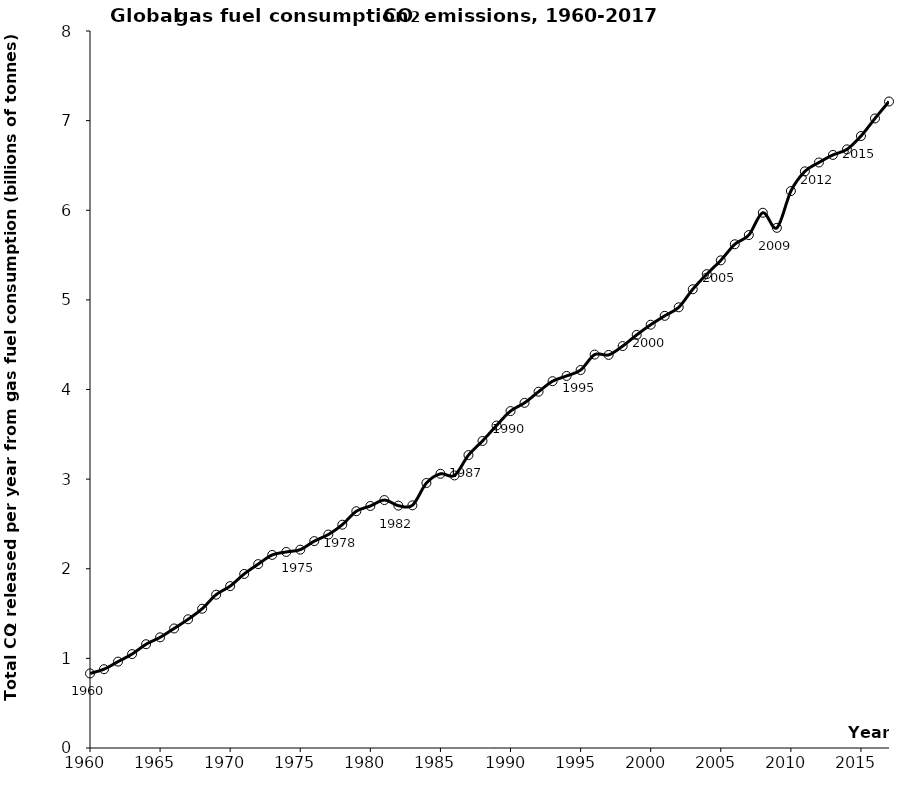
| Category | Series 0 |
|---|---|
| 1960.0 | 0.832 |
| 1961.0 | 0.879 |
| 1962.0 | 0.964 |
| 1963.0 | 1.048 |
| 1964.0 | 1.158 |
| 1965.0 | 1.235 |
| 1966.0 | 1.334 |
| 1967.0 | 1.436 |
| 1968.0 | 1.554 |
| 1969.0 | 1.711 |
| 1970.0 | 1.806 |
| 1971.0 | 1.942 |
| 1972.0 | 2.052 |
| 1973.0 | 2.154 |
| 1974.0 | 2.187 |
| 1975.0 | 2.213 |
| 1976.0 | 2.308 |
| 1977.0 | 2.382 |
| 1978.0 | 2.492 |
| 1979.0 | 2.642 |
| 1980.0 | 2.7 |
| 1981.0 | 2.766 |
| 1982.0 | 2.704 |
| 1983.0 | 2.708 |
| 1984.0 | 2.957 |
| 1985.0 | 3.059 |
| 1986.0 | 3.041 |
| 1987.0 | 3.268 |
| 1988.0 | 3.426 |
| 1989.0 | 3.598 |
| 1990.0 | 3.759 |
| 1991.0 | 3.851 |
| 1992.0 | 3.975 |
| 1993.0 | 4.093 |
| 1994.0 | 4.151 |
| 1995.0 | 4.217 |
| 1996.0 | 4.389 |
| 1997.0 | 4.386 |
| 1998.0 | 4.485 |
| 1999.0 | 4.609 |
| 2000.0 | 4.723 |
| 2001.0 | 4.822 |
| 2002.0 | 4.917 |
| 2003.0 | 5.119 |
| 2004.0 | 5.287 |
| 2005.0 | 5.441 |
| 2006.0 | 5.621 |
| 2007.0 | 5.723 |
| 2008.0 | 5.972 |
| 2009.0 | 5.804 |
| 2010.0 | 6.214 |
| 2011.0 | 6.434 |
| 2012.0 | 6.533 |
| 2013.0 | 6.617 |
| 2014.0 | 6.679 |
| 2015.0 | 6.828 |
| 2016.0 | 7.024 |
| 2017.0 | 7.213 |